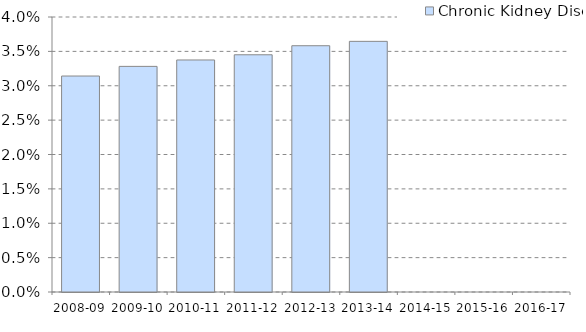
| Category | Chronic Kidney Disease |
|---|---|
| 2008-09 | 0.031 |
| 2009-10 | 0.033 |
| 2010-11 | 0.034 |
| 2011-12 | 0.035 |
| 2012-13 | 0.036 |
| 2013-14 | 0.036 |
| 2014-15 | 0 |
| 2015-16 | 0 |
| 2016-17 | 0 |